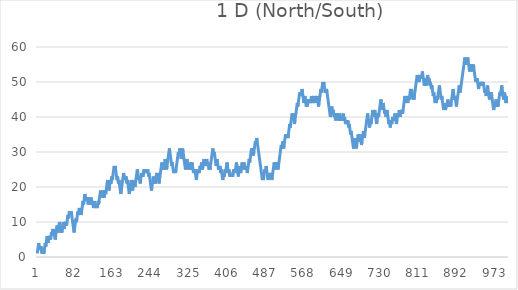
| Category | Series 0 |
|---|---|
| 0 | 1 |
| 1 | 2 |
| 2 | 3 |
| 3 | 4 |
| 4 | 3 |
| 5 | 2 |
| 6 | 3 |
| 7 | 2 |
| 8 | 3 |
| 9 | 2 |
| 10 | 1 |
| 11 | 2 |
| 12 | 1 |
| 13 | 2 |
| 14 | 1 |
| 15 | 2 |
| 16 | 3 |
| 17 | 4 |
| 18 | 3 |
| 19 | 4 |
| 20 | 5 |
| 21 | 6 |
| 22 | 5 |
| 23 | 4 |
| 24 | 5 |
| 25 | 6 |
| 26 | 5 |
| 27 | 6 |
| 28 | 5 |
| 29 | 6 |
| 30 | 7 |
| 31 | 6 |
| 32 | 7 |
| 33 | 8 |
| 34 | 7 |
| 35 | 8 |
| 36 | 7 |
| 37 | 6 |
| 38 | 5 |
| 39 | 6 |
| 40 | 7 |
| 41 | 8 |
| 42 | 9 |
| 43 | 8 |
| 44 | 7 |
| 45 | 8 |
| 46 | 9 |
| 47 | 10 |
| 48 | 9 |
| 49 | 8 |
| 50 | 7 |
| 51 | 8 |
| 52 | 7 |
| 53 | 8 |
| 54 | 9 |
| 55 | 10 |
| 56 | 9 |
| 57 | 8 |
| 58 | 9 |
| 59 | 10 |
| 60 | 9 |
| 61 | 10 |
| 62 | 9 |
| 63 | 10 |
| 64 | 11 |
| 65 | 12 |
| 66 | 11 |
| 67 | 12 |
| 68 | 13 |
| 69 | 12 |
| 70 | 13 |
| 71 | 12 |
| 72 | 13 |
| 73 | 12 |
| 74 | 11 |
| 75 | 10 |
| 76 | 9 |
| 77 | 8 |
| 78 | 7 |
| 79 | 8 |
| 80 | 9 |
| 81 | 10 |
| 82 | 11 |
| 83 | 10 |
| 84 | 11 |
| 85 | 12 |
| 86 | 13 |
| 87 | 12 |
| 88 | 13 |
| 89 | 14 |
| 90 | 13 |
| 91 | 14 |
| 92 | 13 |
| 93 | 12 |
| 94 | 13 |
| 95 | 14 |
| 96 | 15 |
| 97 | 16 |
| 98 | 15 |
| 99 | 16 |
| 100 | 17 |
| 101 | 18 |
| 102 | 17 |
| 103 | 16 |
| 104 | 17 |
| 105 | 16 |
| 106 | 17 |
| 107 | 16 |
| 108 | 15 |
| 109 | 16 |
| 110 | 17 |
| 111 | 16 |
| 112 | 15 |
| 113 | 16 |
| 114 | 17 |
| 115 | 16 |
| 116 | 15 |
| 117 | 16 |
| 118 | 15 |
| 119 | 14 |
| 120 | 15 |
| 121 | 16 |
| 122 | 15 |
| 123 | 14 |
| 124 | 15 |
| 125 | 14 |
| 126 | 15 |
| 127 | 14 |
| 128 | 15 |
| 129 | 16 |
| 130 | 15 |
| 131 | 16 |
| 132 | 17 |
| 133 | 18 |
| 134 | 19 |
| 135 | 18 |
| 136 | 17 |
| 137 | 18 |
| 138 | 17 |
| 139 | 18 |
| 140 | 19 |
| 141 | 18 |
| 142 | 17 |
| 143 | 18 |
| 144 | 19 |
| 145 | 18 |
| 146 | 19 |
| 147 | 20 |
| 148 | 21 |
| 149 | 22 |
| 150 | 21 |
| 151 | 20 |
| 152 | 19 |
| 153 | 20 |
| 154 | 21 |
| 155 | 22 |
| 156 | 21 |
| 157 | 22 |
| 158 | 23 |
| 159 | 22 |
| 160 | 23 |
| 161 | 24 |
| 162 | 25 |
| 163 | 26 |
| 164 | 25 |
| 165 | 26 |
| 166 | 25 |
| 167 | 24 |
| 168 | 23 |
| 169 | 22 |
| 170 | 23 |
| 171 | 22 |
| 172 | 21 |
| 173 | 22 |
| 174 | 21 |
| 175 | 20 |
| 176 | 19 |
| 177 | 18 |
| 178 | 19 |
| 179 | 20 |
| 180 | 21 |
| 181 | 22 |
| 182 | 23 |
| 183 | 24 |
| 184 | 23 |
| 185 | 22 |
| 186 | 23 |
| 187 | 22 |
| 188 | 23 |
| 189 | 22 |
| 190 | 21 |
| 191 | 22 |
| 192 | 21 |
| 193 | 20 |
| 194 | 19 |
| 195 | 18 |
| 196 | 19 |
| 197 | 20 |
| 198 | 21 |
| 199 | 22 |
| 200 | 21 |
| 201 | 20 |
| 202 | 19 |
| 203 | 20 |
| 204 | 21 |
| 205 | 22 |
| 206 | 21 |
| 207 | 20 |
| 208 | 21 |
| 209 | 22 |
| 210 | 23 |
| 211 | 24 |
| 212 | 25 |
| 213 | 24 |
| 214 | 23 |
| 215 | 22 |
| 216 | 23 |
| 217 | 22 |
| 218 | 21 |
| 219 | 22 |
| 220 | 23 |
| 221 | 24 |
| 222 | 23 |
| 223 | 24 |
| 224 | 23 |
| 225 | 24 |
| 226 | 25 |
| 227 | 24 |
| 228 | 25 |
| 229 | 24 |
| 230 | 25 |
| 231 | 24 |
| 232 | 25 |
| 233 | 24 |
| 234 | 25 |
| 235 | 24 |
| 236 | 23 |
| 237 | 24 |
| 238 | 23 |
| 239 | 22 |
| 240 | 21 |
| 241 | 20 |
| 242 | 19 |
| 243 | 20 |
| 244 | 21 |
| 245 | 22 |
| 246 | 23 |
| 247 | 22 |
| 248 | 21 |
| 249 | 22 |
| 250 | 21 |
| 251 | 22 |
| 252 | 23 |
| 253 | 24 |
| 254 | 23 |
| 255 | 24 |
| 256 | 23 |
| 257 | 22 |
| 258 | 21 |
| 259 | 22 |
| 260 | 23 |
| 261 | 24 |
| 262 | 25 |
| 263 | 26 |
| 264 | 27 |
| 265 | 26 |
| 266 | 25 |
| 267 | 26 |
| 268 | 25 |
| 269 | 26 |
| 270 | 27 |
| 271 | 28 |
| 272 | 27 |
| 273 | 26 |
| 274 | 25 |
| 275 | 26 |
| 276 | 27 |
| 277 | 28 |
| 278 | 29 |
| 279 | 30 |
| 280 | 31 |
| 281 | 30 |
| 282 | 29 |
| 283 | 28 |
| 284 | 27 |
| 285 | 26 |
| 286 | 27 |
| 287 | 26 |
| 288 | 25 |
| 289 | 24 |
| 290 | 25 |
| 291 | 24 |
| 292 | 25 |
| 293 | 24 |
| 294 | 25 |
| 295 | 26 |
| 296 | 27 |
| 297 | 28 |
| 298 | 29 |
| 299 | 30 |
| 300 | 29 |
| 301 | 30 |
| 302 | 31 |
| 303 | 30 |
| 304 | 29 |
| 305 | 28 |
| 306 | 29 |
| 307 | 30 |
| 308 | 31 |
| 309 | 30 |
| 310 | 29 |
| 311 | 28 |
| 312 | 27 |
| 313 | 26 |
| 314 | 25 |
| 315 | 26 |
| 316 | 27 |
| 317 | 28 |
| 318 | 27 |
| 319 | 26 |
| 320 | 25 |
| 321 | 26 |
| 322 | 25 |
| 323 | 26 |
| 324 | 27 |
| 325 | 26 |
| 326 | 25 |
| 327 | 26 |
| 328 | 27 |
| 329 | 26 |
| 330 | 25 |
| 331 | 24 |
| 332 | 25 |
| 333 | 24 |
| 334 | 25 |
| 335 | 24 |
| 336 | 23 |
| 337 | 22 |
| 338 | 23 |
| 339 | 24 |
| 340 | 25 |
| 341 | 24 |
| 342 | 25 |
| 343 | 24 |
| 344 | 25 |
| 345 | 26 |
| 346 | 25 |
| 347 | 26 |
| 348 | 27 |
| 349 | 26 |
| 350 | 25 |
| 351 | 26 |
| 352 | 27 |
| 353 | 28 |
| 354 | 27 |
| 355 | 26 |
| 356 | 27 |
| 357 | 26 |
| 358 | 27 |
| 359 | 28 |
| 360 | 27 |
| 361 | 26 |
| 362 | 27 |
| 363 | 26 |
| 364 | 25 |
| 365 | 26 |
| 366 | 25 |
| 367 | 26 |
| 368 | 27 |
| 369 | 28 |
| 370 | 29 |
| 371 | 30 |
| 372 | 31 |
| 373 | 30 |
| 374 | 29 |
| 375 | 30 |
| 376 | 29 |
| 377 | 28 |
| 378 | 27 |
| 379 | 26 |
| 380 | 27 |
| 381 | 28 |
| 382 | 27 |
| 383 | 26 |
| 384 | 25 |
| 385 | 26 |
| 386 | 25 |
| 387 | 26 |
| 388 | 25 |
| 389 | 24 |
| 390 | 25 |
| 391 | 24 |
| 392 | 23 |
| 393 | 22 |
| 394 | 23 |
| 395 | 24 |
| 396 | 23 |
| 397 | 24 |
| 398 | 25 |
| 399 | 24 |
| 400 | 25 |
| 401 | 26 |
| 402 | 27 |
| 403 | 26 |
| 404 | 25 |
| 405 | 24 |
| 406 | 25 |
| 407 | 24 |
| 408 | 23 |
| 409 | 24 |
| 410 | 23 |
| 411 | 24 |
| 412 | 23 |
| 413 | 24 |
| 414 | 23 |
| 415 | 24 |
| 416 | 25 |
| 417 | 24 |
| 418 | 25 |
| 419 | 24 |
| 420 | 25 |
| 421 | 26 |
| 422 | 27 |
| 423 | 26 |
| 424 | 25 |
| 425 | 24 |
| 426 | 23 |
| 427 | 24 |
| 428 | 25 |
| 429 | 26 |
| 430 | 25 |
| 431 | 24 |
| 432 | 25 |
| 433 | 26 |
| 434 | 27 |
| 435 | 26 |
| 436 | 25 |
| 437 | 26 |
| 438 | 27 |
| 439 | 26 |
| 440 | 25 |
| 441 | 26 |
| 442 | 25 |
| 443 | 26 |
| 444 | 25 |
| 445 | 24 |
| 446 | 25 |
| 447 | 26 |
| 448 | 27 |
| 449 | 28 |
| 450 | 27 |
| 451 | 28 |
| 452 | 29 |
| 453 | 30 |
| 454 | 31 |
| 455 | 30 |
| 456 | 31 |
| 457 | 30 |
| 458 | 29 |
| 459 | 30 |
| 460 | 31 |
| 461 | 32 |
| 462 | 33 |
| 463 | 32 |
| 464 | 33 |
| 465 | 34 |
| 466 | 33 |
| 467 | 32 |
| 468 | 31 |
| 469 | 30 |
| 470 | 29 |
| 471 | 28 |
| 472 | 27 |
| 473 | 26 |
| 474 | 25 |
| 475 | 24 |
| 476 | 23 |
| 477 | 22 |
| 478 | 23 |
| 479 | 22 |
| 480 | 23 |
| 481 | 24 |
| 482 | 25 |
| 483 | 24 |
| 484 | 25 |
| 485 | 26 |
| 486 | 25 |
| 487 | 24 |
| 488 | 23 |
| 489 | 22 |
| 490 | 23 |
| 491 | 24 |
| 492 | 23 |
| 493 | 24 |
| 494 | 23 |
| 495 | 24 |
| 496 | 23 |
| 497 | 22 |
| 498 | 23 |
| 499 | 24 |
| 500 | 25 |
| 501 | 26 |
| 502 | 27 |
| 503 | 26 |
| 504 | 27 |
| 505 | 26 |
| 506 | 25 |
| 507 | 26 |
| 508 | 27 |
| 509 | 26 |
| 510 | 25 |
| 511 | 26 |
| 512 | 27 |
| 513 | 28 |
| 514 | 29 |
| 515 | 30 |
| 516 | 31 |
| 517 | 32 |
| 518 | 31 |
| 519 | 32 |
| 520 | 33 |
| 521 | 32 |
| 522 | 31 |
| 523 | 32 |
| 524 | 33 |
| 525 | 34 |
| 526 | 35 |
| 527 | 34 |
| 528 | 35 |
| 529 | 34 |
| 530 | 35 |
| 531 | 34 |
| 532 | 35 |
| 533 | 36 |
| 534 | 37 |
| 535 | 38 |
| 536 | 37 |
| 537 | 38 |
| 538 | 39 |
| 539 | 40 |
| 540 | 41 |
| 541 | 40 |
| 542 | 41 |
| 543 | 40 |
| 544 | 39 |
| 545 | 38 |
| 546 | 39 |
| 547 | 40 |
| 548 | 41 |
| 549 | 42 |
| 550 | 43 |
| 551 | 44 |
| 552 | 43 |
| 553 | 44 |
| 554 | 45 |
| 555 | 46 |
| 556 | 47 |
| 557 | 46 |
| 558 | 47 |
| 559 | 46 |
| 560 | 47 |
| 561 | 48 |
| 562 | 47 |
| 563 | 46 |
| 564 | 45 |
| 565 | 44 |
| 566 | 45 |
| 567 | 46 |
| 568 | 45 |
| 569 | 44 |
| 570 | 43 |
| 571 | 44 |
| 572 | 43 |
| 573 | 44 |
| 574 | 45 |
| 575 | 44 |
| 576 | 45 |
| 577 | 44 |
| 578 | 45 |
| 579 | 44 |
| 580 | 45 |
| 581 | 46 |
| 582 | 45 |
| 583 | 44 |
| 584 | 45 |
| 585 | 44 |
| 586 | 45 |
| 587 | 46 |
| 588 | 45 |
| 589 | 46 |
| 590 | 45 |
| 591 | 44 |
| 592 | 45 |
| 593 | 46 |
| 594 | 45 |
| 595 | 44 |
| 596 | 43 |
| 597 | 44 |
| 598 | 45 |
| 599 | 46 |
| 600 | 47 |
| 601 | 48 |
| 602 | 47 |
| 603 | 48 |
| 604 | 49 |
| 605 | 50 |
| 606 | 49 |
| 607 | 50 |
| 608 | 49 |
| 609 | 48 |
| 610 | 47 |
| 611 | 48 |
| 612 | 47 |
| 613 | 48 |
| 614 | 47 |
| 615 | 46 |
| 616 | 45 |
| 617 | 44 |
| 618 | 43 |
| 619 | 42 |
| 620 | 41 |
| 621 | 40 |
| 622 | 41 |
| 623 | 42 |
| 624 | 43 |
| 625 | 42 |
| 626 | 41 |
| 627 | 42 |
| 628 | 41 |
| 629 | 40 |
| 630 | 41 |
| 631 | 40 |
| 632 | 39 |
| 633 | 40 |
| 634 | 41 |
| 635 | 40 |
| 636 | 41 |
| 637 | 40 |
| 638 | 39 |
| 639 | 40 |
| 640 | 41 |
| 641 | 40 |
| 642 | 39 |
| 643 | 40 |
| 644 | 39 |
| 645 | 40 |
| 646 | 39 |
| 647 | 40 |
| 648 | 41 |
| 649 | 40 |
| 650 | 39 |
| 651 | 40 |
| 652 | 39 |
| 653 | 38 |
| 654 | 39 |
| 655 | 38 |
| 656 | 39 |
| 657 | 38 |
| 658 | 39 |
| 659 | 38 |
| 660 | 37 |
| 661 | 38 |
| 662 | 37 |
| 663 | 36 |
| 664 | 35 |
| 665 | 36 |
| 666 | 35 |
| 667 | 34 |
| 668 | 33 |
| 669 | 32 |
| 670 | 31 |
| 671 | 32 |
| 672 | 33 |
| 673 | 34 |
| 674 | 33 |
| 675 | 32 |
| 676 | 31 |
| 677 | 32 |
| 678 | 33 |
| 679 | 34 |
| 680 | 35 |
| 681 | 34 |
| 682 | 33 |
| 683 | 34 |
| 684 | 35 |
| 685 | 34 |
| 686 | 33 |
| 687 | 32 |
| 688 | 33 |
| 689 | 34 |
| 690 | 35 |
| 691 | 36 |
| 692 | 35 |
| 693 | 34 |
| 694 | 35 |
| 695 | 36 |
| 696 | 37 |
| 697 | 38 |
| 698 | 39 |
| 699 | 40 |
| 700 | 41 |
| 701 | 40 |
| 702 | 39 |
| 703 | 38 |
| 704 | 37 |
| 705 | 38 |
| 706 | 39 |
| 707 | 38 |
| 708 | 39 |
| 709 | 40 |
| 710 | 41 |
| 711 | 42 |
| 712 | 41 |
| 713 | 40 |
| 714 | 41 |
| 715 | 42 |
| 716 | 41 |
| 717 | 40 |
| 718 | 39 |
| 719 | 38 |
| 720 | 39 |
| 721 | 40 |
| 722 | 41 |
| 723 | 40 |
| 724 | 41 |
| 725 | 42 |
| 726 | 43 |
| 727 | 44 |
| 728 | 45 |
| 729 | 44 |
| 730 | 43 |
| 731 | 42 |
| 732 | 43 |
| 733 | 44 |
| 734 | 43 |
| 735 | 42 |
| 736 | 41 |
| 737 | 42 |
| 738 | 41 |
| 739 | 40 |
| 740 | 41 |
| 741 | 42 |
| 742 | 41 |
| 743 | 40 |
| 744 | 39 |
| 745 | 38 |
| 746 | 39 |
| 747 | 38 |
| 748 | 37 |
| 749 | 38 |
| 750 | 39 |
| 751 | 38 |
| 752 | 39 |
| 753 | 40 |
| 754 | 39 |
| 755 | 40 |
| 756 | 39 |
| 757 | 40 |
| 758 | 41 |
| 759 | 40 |
| 760 | 39 |
| 761 | 38 |
| 762 | 39 |
| 763 | 40 |
| 764 | 41 |
| 765 | 40 |
| 766 | 41 |
| 767 | 42 |
| 768 | 41 |
| 769 | 40 |
| 770 | 41 |
| 771 | 42 |
| 772 | 41 |
| 773 | 42 |
| 774 | 41 |
| 775 | 42 |
| 776 | 43 |
| 777 | 44 |
| 778 | 45 |
| 779 | 46 |
| 780 | 45 |
| 781 | 44 |
| 782 | 45 |
| 783 | 46 |
| 784 | 45 |
| 785 | 44 |
| 786 | 45 |
| 787 | 46 |
| 788 | 45 |
| 789 | 46 |
| 790 | 47 |
| 791 | 48 |
| 792 | 47 |
| 793 | 48 |
| 794 | 47 |
| 795 | 46 |
| 796 | 45 |
| 797 | 46 |
| 798 | 45 |
| 799 | 46 |
| 800 | 47 |
| 801 | 48 |
| 802 | 49 |
| 803 | 50 |
| 804 | 51 |
| 805 | 52 |
| 806 | 51 |
| 807 | 50 |
| 808 | 51 |
| 809 | 50 |
| 810 | 51 |
| 811 | 52 |
| 812 | 51 |
| 813 | 52 |
| 814 | 51 |
| 815 | 52 |
| 816 | 53 |
| 817 | 52 |
| 818 | 51 |
| 819 | 50 |
| 820 | 49 |
| 821 | 50 |
| 822 | 51 |
| 823 | 50 |
| 824 | 49 |
| 825 | 50 |
| 826 | 51 |
| 827 | 52 |
| 828 | 51 |
| 829 | 50 |
| 830 | 51 |
| 831 | 50 |
| 832 | 49 |
| 833 | 50 |
| 834 | 49 |
| 835 | 48 |
| 836 | 49 |
| 837 | 48 |
| 838 | 47 |
| 839 | 46 |
| 840 | 47 |
| 841 | 46 |
| 842 | 45 |
| 843 | 44 |
| 844 | 45 |
| 845 | 44 |
| 846 | 45 |
| 847 | 46 |
| 848 | 45 |
| 849 | 46 |
| 850 | 47 |
| 851 | 48 |
| 852 | 49 |
| 853 | 48 |
| 854 | 47 |
| 855 | 46 |
| 856 | 45 |
| 857 | 46 |
| 858 | 45 |
| 859 | 44 |
| 860 | 43 |
| 861 | 42 |
| 862 | 43 |
| 863 | 44 |
| 864 | 43 |
| 865 | 42 |
| 866 | 43 |
| 867 | 44 |
| 868 | 43 |
| 869 | 44 |
| 870 | 45 |
| 871 | 44 |
| 872 | 43 |
| 873 | 44 |
| 874 | 43 |
| 875 | 44 |
| 876 | 43 |
| 877 | 44 |
| 878 | 45 |
| 879 | 46 |
| 880 | 47 |
| 881 | 48 |
| 882 | 47 |
| 883 | 46 |
| 884 | 45 |
| 885 | 46 |
| 886 | 45 |
| 887 | 44 |
| 888 | 43 |
| 889 | 44 |
| 890 | 45 |
| 891 | 46 |
| 892 | 47 |
| 893 | 48 |
| 894 | 49 |
| 895 | 48 |
| 896 | 47 |
| 897 | 48 |
| 898 | 49 |
| 899 | 50 |
| 900 | 51 |
| 901 | 52 |
| 902 | 53 |
| 903 | 54 |
| 904 | 55 |
| 905 | 56 |
| 906 | 57 |
| 907 | 56 |
| 908 | 55 |
| 909 | 56 |
| 910 | 55 |
| 911 | 56 |
| 912 | 57 |
| 913 | 56 |
| 914 | 55 |
| 915 | 54 |
| 916 | 53 |
| 917 | 54 |
| 918 | 55 |
| 919 | 54 |
| 920 | 55 |
| 921 | 54 |
| 922 | 53 |
| 923 | 54 |
| 924 | 55 |
| 925 | 54 |
| 926 | 53 |
| 927 | 52 |
| 928 | 51 |
| 929 | 50 |
| 930 | 51 |
| 931 | 50 |
| 932 | 51 |
| 933 | 50 |
| 934 | 49 |
| 935 | 48 |
| 936 | 49 |
| 937 | 50 |
| 938 | 49 |
| 939 | 50 |
| 940 | 49 |
| 941 | 50 |
| 942 | 49 |
| 943 | 50 |
| 944 | 49 |
| 945 | 50 |
| 946 | 49 |
| 947 | 48 |
| 948 | 47 |
| 949 | 48 |
| 950 | 47 |
| 951 | 46 |
| 952 | 47 |
| 953 | 48 |
| 954 | 49 |
| 955 | 48 |
| 956 | 47 |
| 957 | 46 |
| 958 | 45 |
| 959 | 46 |
| 960 | 47 |
| 961 | 46 |
| 962 | 47 |
| 963 | 46 |
| 964 | 45 |
| 965 | 44 |
| 966 | 43 |
| 967 | 42 |
| 968 | 43 |
| 969 | 44 |
| 970 | 43 |
| 971 | 44 |
| 972 | 45 |
| 973 | 44 |
| 974 | 43 |
| 975 | 44 |
| 976 | 43 |
| 977 | 44 |
| 978 | 45 |
| 979 | 46 |
| 980 | 47 |
| 981 | 46 |
| 982 | 47 |
| 983 | 48 |
| 984 | 49 |
| 985 | 48 |
| 986 | 47 |
| 987 | 46 |
| 988 | 45 |
| 989 | 46 |
| 990 | 47 |
| 991 | 46 |
| 992 | 45 |
| 993 | 44 |
| 994 | 45 |
| 995 | 44 |
| 996 | 45 |
| 997 | 46 |
| 998 | 45 |
| 999 | 46 |